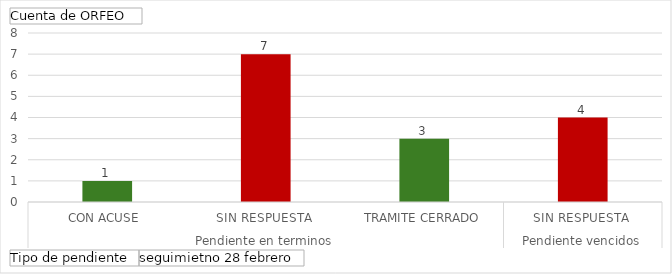
| Category | Total |
|---|---|
| 0 | 1 |
| 1 | 7 |
| 2 | 3 |
| 3 | 4 |